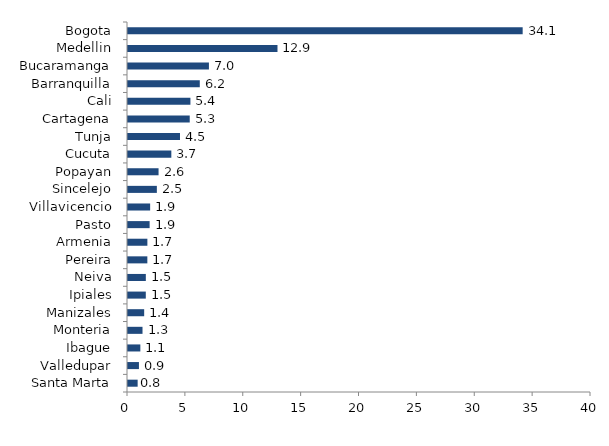
| Category | Series 0 |
|---|---|
| Santa Marta | 0.833 |
| Valledupar | 0.945 |
| Ibague | 1.066 |
| Monteria | 1.254 |
| Manizales | 1.397 |
| Ipiales | 1.538 |
| Neiva | 1.54 |
| Pereira | 1.671 |
| Armenia | 1.674 |
| Pasto | 1.868 |
| Villavicencio | 1.913 |
| Sincelejo | 2.493 |
| Popayan | 2.64 |
| Cucuta | 3.743 |
| Tunja | 4.492 |
| Cartagena | 5.333 |
| Cali | 5.393 |
| Barranquilla | 6.202 |
| Bucaramanga | 6.991 |
| Medellin | 12.915 |
| Bogota | 34.097 |